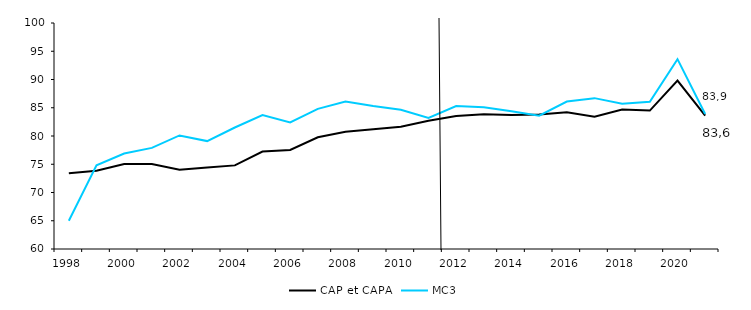
| Category | CAP et CAPA  | MC3 |
|---|---|---|
| 1998.0 | 73.402 | 65 |
| 1999.0 | 73.869 | 74.8 |
| 2000.0 | 75.049 | 76.9 |
| 2001.0 | 75.03 | 77.9 |
| 2002.0 | 74.009 | 80.1 |
| 2003.0 | 74.408 | 79.1 |
| 2004.0 | 74.799 | 81.5 |
| 2005.0 | 77.242 | 83.7 |
| 2006.0 | 77.539 | 82.4 |
| 2007.0 | 79.773 | 84.8 |
| 2008.0 | 80.734 | 86.1 |
| 2009.0 | 81.187 | 85.3 |
| 2010.0 | 81.622 | 84.636 |
| 2011.0 | 82.716 | 83.2 |
| 2012.0 | 83.548 | 85.3 |
| 2013.0 | 83.838 | 85.084 |
| 2014.0 | 83.7 | 84.4 |
| 2015.0 | 83.8 | 83.6 |
| 2016.0 | 84.2 | 86.1 |
| 2017.0 | 83.4 | 86.7 |
| 2018.0 | 84.7 | 85.7 |
| 2019.0 | 84.5 | 86.063 |
| 2020.0 | 89.8 | 93.6 |
| 2021.0 | 83.6 | 83.9 |